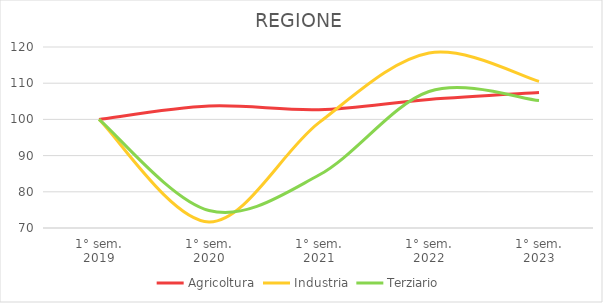
| Category | Agricoltura | Industria | Terziario |
|---|---|---|---|
| 1° sem.
2019 | 100 | 100 | 100 |
| 1° sem.
2020 | 103.686 | 71.689 | 74.841 |
| 1° sem.
2021 | 102.688 | 99.096 | 84.626 |
| 1° sem.
2022 | 105.52 | 118.326 | 107.699 |
| 1° sem.
2023 | 107.43 | 110.503 | 105.201 |